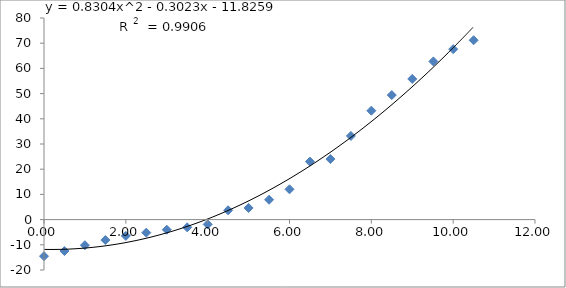
| Category | Series 0 |
|---|---|
| 0.0 | -14.53 |
| 0.5 | -12.48 |
| 1.0 | -10.17 |
| 1.5 | -8.12 |
| 2.0 | -6.47 |
| 2.5 | -5.19 |
| 3.0 | -4.01 |
| 3.5 | -3.07 |
| 4.0 | -1.9 |
| 4.5 | 3.69 |
| 5.0 | 4.62 |
| 5.5 | 7.88 |
| 6.0 | 12.02 |
| 6.5 | 23.01 |
| 7.0 | 24.03 |
| 7.5 | 33.21 |
| 8.0 | 43.22 |
| 8.5 | 49.42 |
| 9.0 | 55.81 |
| 9.516666666666667 | 62.77 |
| 10.0 | 67.64 |
| 10.5 | 71.18 |